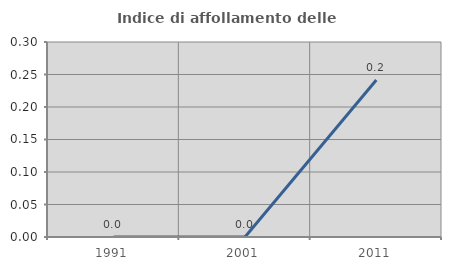
| Category | Indice di affollamento delle abitazioni  |
|---|---|
| 1991.0 | 0 |
| 2001.0 | 0 |
| 2011.0 | 0.242 |